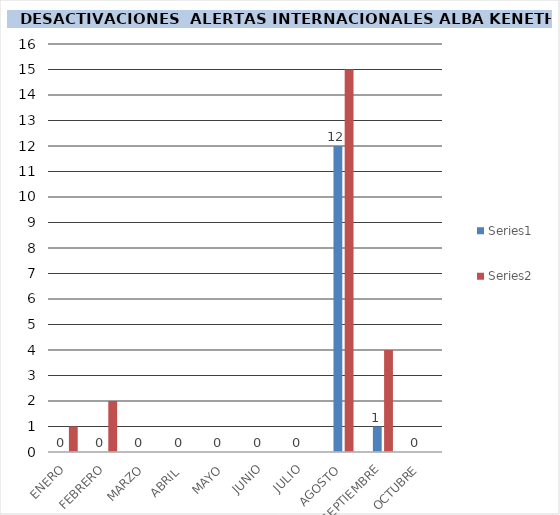
| Category | Series 0 | Series 1 |
|---|---|---|
| ENERO | 0 | 1 |
| FEBRERO | 0 | 2 |
| MARZO | 0 | 0 |
| ABRIL  | 0 | 0 |
| MAYO | 0 | 0 |
| JUNIO | 0 | 0 |
| JULIO | 0 | 0 |
| AGOSTO | 12 | 15 |
| SEPTIEMBRE | 1 | 4 |
| OCTUBRE | 0 | 0 |